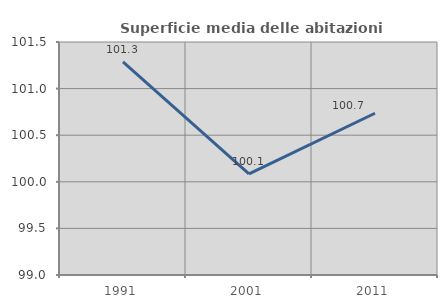
| Category | Superficie media delle abitazioni occupate |
|---|---|
| 1991.0 | 101.286 |
| 2001.0 | 100.084 |
| 2011.0 | 100.735 |